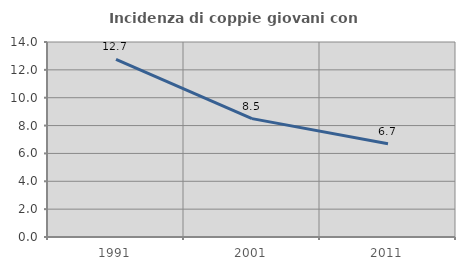
| Category | Incidenza di coppie giovani con figli |
|---|---|
| 1991.0 | 12.748 |
| 2001.0 | 8.499 |
| 2011.0 | 6.694 |